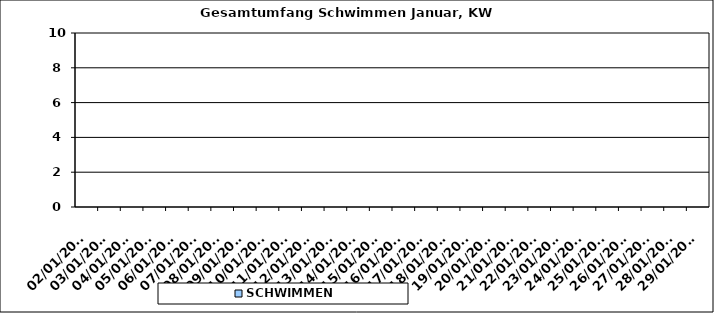
| Category | SCHWIMMEN |
|---|---|
| 02/01/2023 | 0 |
| 03/01/2023 | 0 |
| 04/01/2023 | 0 |
| 05/01/2023 | 0 |
| 06/01/2023 | 0 |
| 07/01/2023 | 0 |
| 08/01/2023 | 0 |
| 09/01/2023 | 0 |
| 10/01/2023 | 0 |
| 11/01/2023 | 0 |
| 12/01/2023 | 0 |
| 13/01/2023 | 0 |
| 14/01/2023 | 0 |
| 15/01/2023 | 0 |
| 16/01/2023 | 0 |
| 17/01/2023 | 0 |
| 18/01/2023 | 0 |
| 19/01/2023 | 0 |
| 20/01/2023 | 0 |
| 21/01/2023 | 0 |
| 22/01/2023 | 0 |
| 23/01/2023 | 0 |
| 24/01/2023 | 0 |
| 25/01/2023 | 0 |
| 26/01/2023 | 0 |
| 27/01/2023 | 0 |
| 28/01/2023 | 0 |
| 29/01/2023 | 0 |